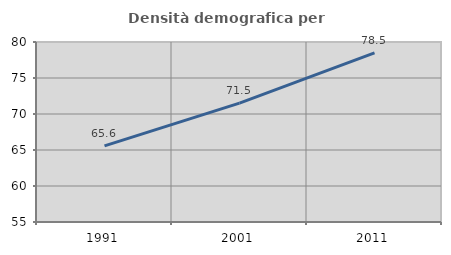
| Category | Densità demografica |
|---|---|
| 1991.0 | 65.564 |
| 2001.0 | 71.506 |
| 2011.0 | 78.483 |